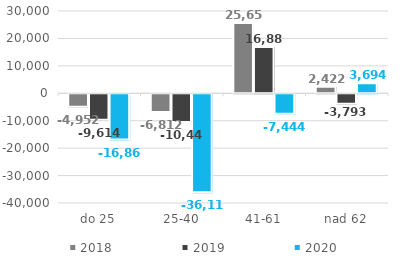
| Category | 2018 | 2019 | 2020 |
|---|---|---|---|
| do 25 | -4952.167 | -9613.667 | -16864.917 |
| 25-40 | -6812 | -10445.25 | -36114.917 |
| 41-61 | 25653.333 | 16881.5 | -7444.083 |
| nad 62 | 2421.917 | -3792.667 | 3693.833 |